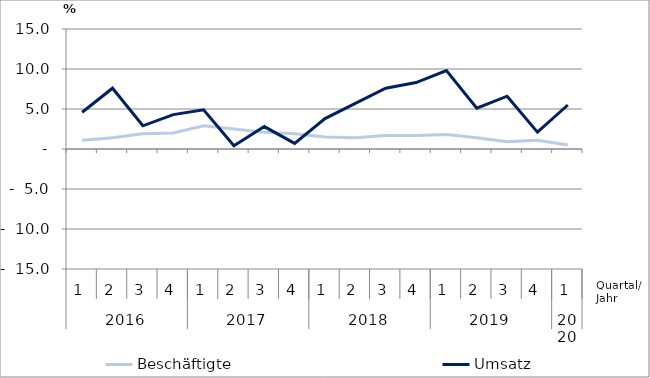
| Category | Beschäftigte | Umsatz |
|---|---|---|
| 0 | 1.1 | 4.6 |
| 1 | 1.4 | 7.6 |
| 2 | 1.9 | 2.9 |
| 3 | 2 | 4.3 |
| 4 | 2.9 | 4.9 |
| 5 | 2.5 | 0.4 |
| 6 | 2.1 | 2.8 |
| 7 | 1.9 | 0.7 |
| 8 | 1.5 | 3.8 |
| 9 | 1.4 | 5.7 |
| 10 | 1.7 | 7.6 |
| 11 | 1.7 | 8.3 |
| 12 | 1.8 | 9.8 |
| 13 | 1.4 | 5.1 |
| 14 | 0.9 | 6.6 |
| 15 | 1.1 | 2.1 |
| 16 | 0.5 | 5.5 |